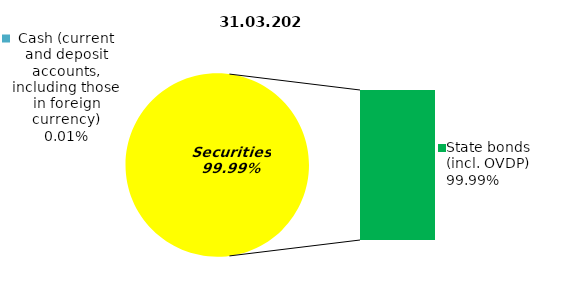
| Category | Series 0 |
|---|---|
| Cash (current and deposit accounts, including those in foreign currency) | 0.01 |
| Bank metals | 0 |
| Real estate | 0 |
| Other assets | 0 |
| Equities | 0 |
| Corporate bonds | 0 |
| Municipal bonds | 0 |
| State bonds (incl. OVDP) | 131.14 |
| Mortgage Certificates | 0 |